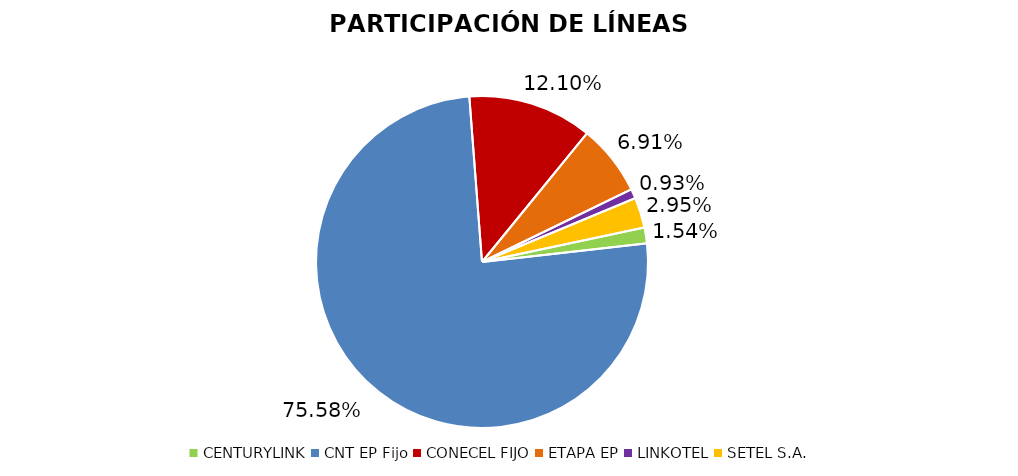
| Category | Participación en el Mercado |
|---|---|
| CENTURYLINK | 0.015 |
| CNT EP Fijo | 0.756 |
| CONECEL FIJO | 0.121 |
| ETAPA EP | 0.069 |
| LINKOTEL | 0.009 |
| SETEL S.A. | 0.029 |